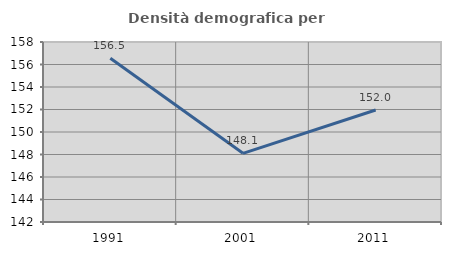
| Category | Densità demografica |
|---|---|
| 1991.0 | 156.549 |
| 2001.0 | 148.105 |
| 2011.0 | 151.957 |